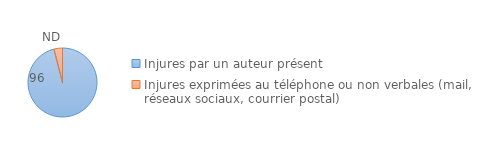
| Category | Series 0 |
|---|---|
| Injures par un auteur présent | 96 |
| Injures exprimées au téléphone ou non verbales (mail, réseaux sociaux, courrier postal) | 4 |